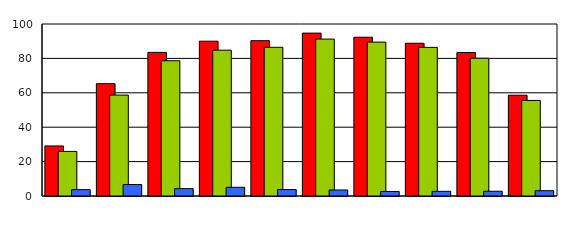
| Category | Series 0 | Series 1 | Series 2 |
|---|---|---|---|
| 0 | 29.1 | 25.926 | 3.704 |
| 1 | 65.3 | 58.667 | 6.667 |
| 2 | 83.5 | 78.632 | 4.274 |
| 3 | 90 | 84.783 | 5.072 |
| 4 | 90.3 | 86.466 | 3.759 |
| 5 | 94.7 | 91.228 | 3.509 |
| 6 | 92.3 | 89.474 | 2.632 |
| 7 | 88.8 | 86.413 | 2.717 |
| 8 | 83.4 | 80.11 | 2.762 |
| 9 | 58.6 | 55.556 | 3.086 |